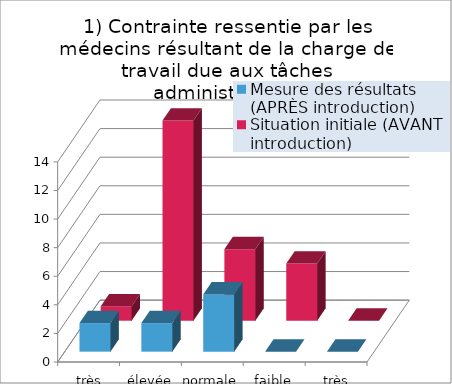
| Category | Mesure des résultats (APRÈS introduction) | Situation initiale (AVANT introduction) |
|---|---|---|
| très élevée | 2 | 1 |
| élevée | 2 | 14 |
| normale | 4 | 5 |
| faible | 0 | 4 |
| très faible | 0 | 0 |